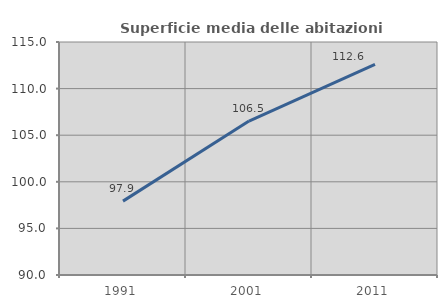
| Category | Superficie media delle abitazioni occupate |
|---|---|
| 1991.0 | 97.926 |
| 2001.0 | 106.519 |
| 2011.0 | 112.592 |